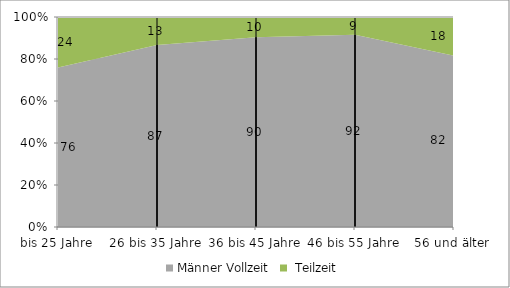
| Category | Männer |
|---|---|
| bis 25 Jahre | 24 |
| 26 bis 35 Jahre | 13.3 |
| 36 bis 45 Jahre | 9.6 |
| 46 bis 55 Jahre | 8.5 |
| 56 und älter | 18.4 |